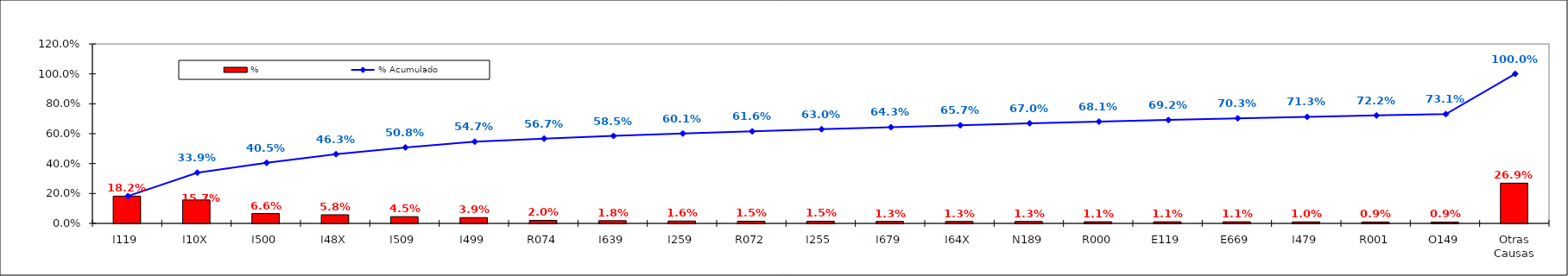
| Category | % |
|---|---|
| I119 | 0.182 |
| I10X | 0.157 |
| I500 | 0.066 |
| I48X | 0.058 |
| I509 | 0.045 |
| I499 | 0.039 |
| R074 | 0.02 |
| I639 | 0.018 |
| I259 | 0.016 |
| R072 | 0.015 |
| I255 | 0.015 |
| I679 | 0.013 |
| I64X | 0.013 |
| N189 | 0.013 |
| R000 | 0.011 |
| E119 | 0.011 |
| E669 | 0.011 |
| I479 | 0.01 |
| R001 | 0.009 |
| O149 | 0.009 |
| Otras Causas | 0.269 |